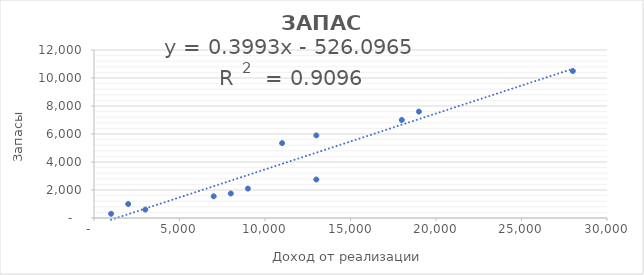
| Category | Series 0 |
|---|---|
| 2000.0 | 1000 |
| 8000.0 | 1750 |
| 18000.0 | 7000 |
| 11000.0 | 5350 |
| 13000.0 | 5900 |
| 19000.0 | 7600 |
| 28000.0 | 10500 |
| 13000.0 | 2750 |
| 9000.0 | 2100 |
| 7000.0 | 1550 |
| 3000.0 | 600 |
| 1000.0 | 300 |